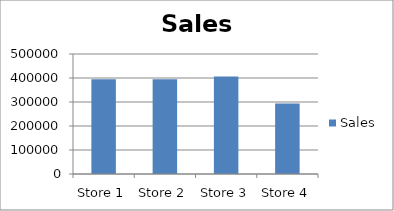
| Category | Sales |
|---|---|
| Store 1 | 394837 |
| Store 2 | 394852 |
| Store 3 | 405968 |
| Store 4 | 293845 |